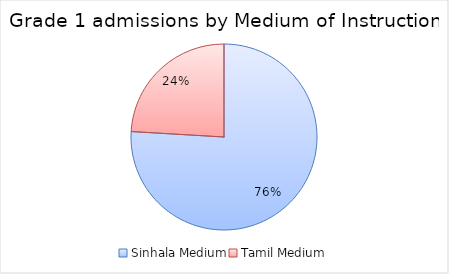
| Category | Series 0 |
|---|---|
| Sinhala Medium | 249008 |
| Tamil Medium | 78917 |